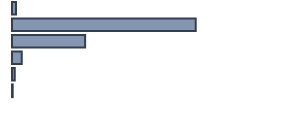
| Category | Series 0 |
|---|---|
| 0 | 1.46 |
| 1 | 67.053 |
| 2 | 26.695 |
| 3 | 3.6 |
| 4 | 0.988 |
| 5 | 0.253 |